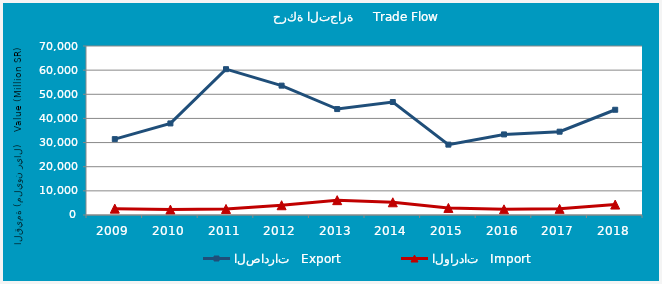
| Category | الصادرات   Export | الواردات   Import |
|---|---|---|
| 2009.0 | 31429244188 | 2635313266 |
| 2010.0 | 37930541398 | 2242456549 |
| 2011.0 | 60398111968 | 2505525881 |
| 2012.0 | 53581567487 | 4043840643 |
| 2013.0 | 43875836006 | 6141905467 |
| 2014.0 | 46797600415 | 5264405083 |
| 2015.0 | 29145248198 | 2926294264 |
| 2016.0 | 33376647159 | 2343302676 |
| 2017.0 | 34511510199 | 2543688749 |
| 2018.0 | 43592756258 | 4319232322 |